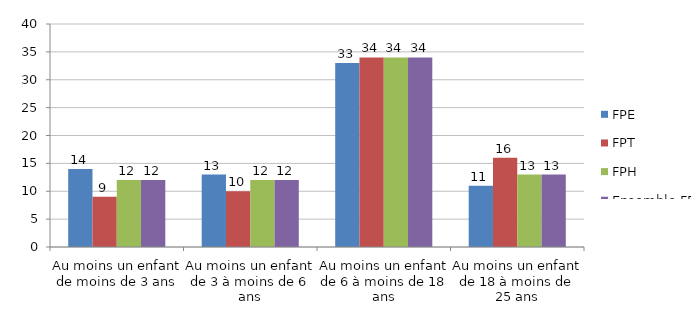
| Category | FPE | FPT | FPH | Ensemble FP |
|---|---|---|---|---|
| Au moins un enfant de moins de 3 ans | 14 | 9 | 12 | 12 |
| Au moins un enfant de 3 à moins de 6 ans | 13 | 10 | 12 | 12 |
| Au moins un enfant de 6 à moins de 18 ans | 33 | 34 | 34 | 34 |
| Au moins un enfant de 18 à moins de 25 ans | 11 | 16 | 13 | 13 |